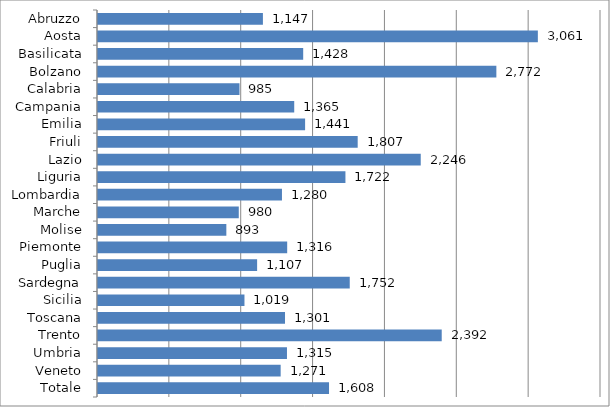
| Category | Series 0 |
|---|---|
| Abruzzo | 1147.494 |
| Aosta | 3060.578 |
| Basilicata | 1427.808 |
| Bolzano | 2771.897 |
| Calabria | 984.511 |
| Campania | 1365.391 |
| Emilia | 1441.053 |
| Friuli | 1807.001 |
| Lazio | 2245.695 |
| Liguria | 1721.722 |
| Lombardia | 1280.067 |
| Marche | 979.539 |
| Molise | 893.037 |
| Piemonte | 1316.391 |
| Puglia | 1107.194 |
| Sardegna | 1751.708 |
| Sicilia | 1019.141 |
| Toscana | 1301.232 |
| Trento | 2391.706 |
| Umbria | 1314.923 |
| Veneto | 1271.017 |
| Totale | 1607.52 |